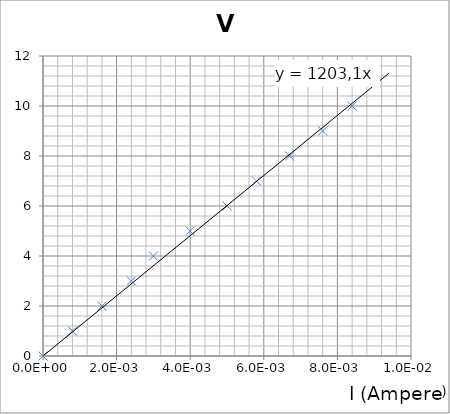
| Category | V (V) |
|---|---|
| 0.0 | 0 |
| 0.0008 | 1 |
| 0.0016 | 2 |
| 0.0024 | 3 |
| 0.003 | 4 |
| 0.004 | 5 |
| 0.005 | 6 |
| 0.0058 | 7 |
| 0.0067 | 8 |
| 0.0076 | 9 |
| 0.008400000000000001 | 10 |